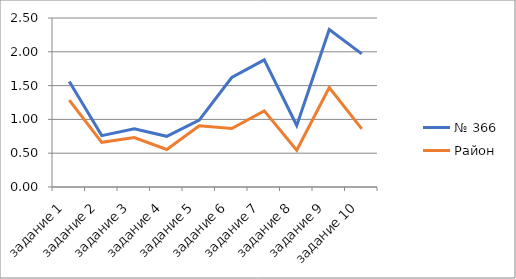
| Category | № 366 | Район |
|---|---|---|
| задание 1 | 1.56 | 1.284 |
| задание 2 | 0.76 | 0.661 |
| задание 3 | 0.86 | 0.733 |
| задание 4 | 0.75 | 0.555 |
| задание 5 | 0.99 | 0.906 |
| задание 6 | 1.62 | 0.865 |
| задание 7 | 1.88 | 1.127 |
| задание 8 | 0.91 | 0.543 |
| задание 9 | 2.33 | 1.472 |
| задание 10 | 1.97 | 0.859 |